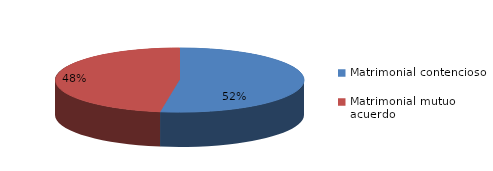
| Category | Series 0 |
|---|---|
| 0 | 2184 |
| 1 | 1979 |